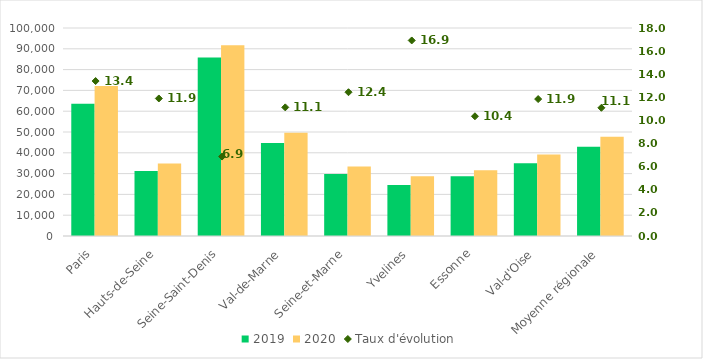
| Category | 2019 | 2020 |
|---|---|---|
| Paris | 63574 | 72099 |
| Hauts-de-Seine | 31197 | 34910 |
| Seine-Saint-Denis | 85818 | 91718 |
| Val-de-Marne | 44691 | 49666 |
| Seine-et-Marne | 29754 | 33456 |
| Yvelines | 24519 | 28668 |
| Essonne | 28676 | 31647 |
| Val-d'Oise | 35004 | 39152 |
| Moyenne régionale | 42904.125 | 47664.5 |